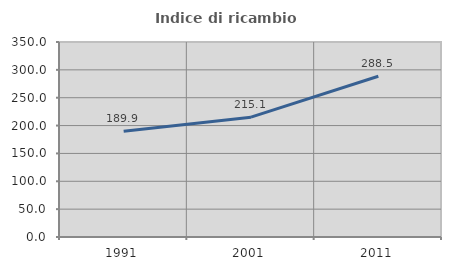
| Category | Indice di ricambio occupazionale  |
|---|---|
| 1991.0 | 189.95 |
| 2001.0 | 215.135 |
| 2011.0 | 288.462 |